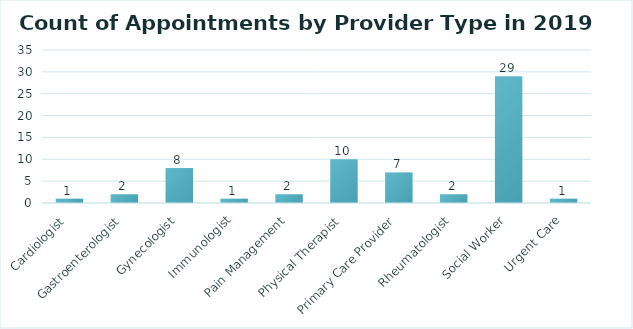
| Category | Count of Appointments |
|---|---|
| Cardiologist | 1 |
| Gastroenterologist | 2 |
| Gynecologist | 8 |
| Immunologist | 1 |
| Pain Management | 2 |
| Physical Therapist | 10 |
| Primary Care Provider | 7 |
| Rheumatologist | 2 |
| Social Worker | 29 |
| Urgent Care | 1 |